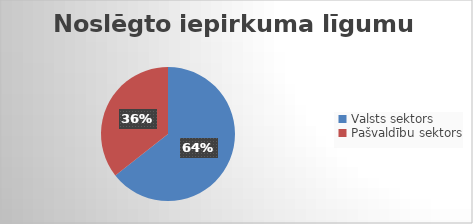
| Category | Noslēgto iepirkuma līgumu skaits |
|---|---|
| Valsts sektors | 503 |
| Pašvaldību sektors | 278 |